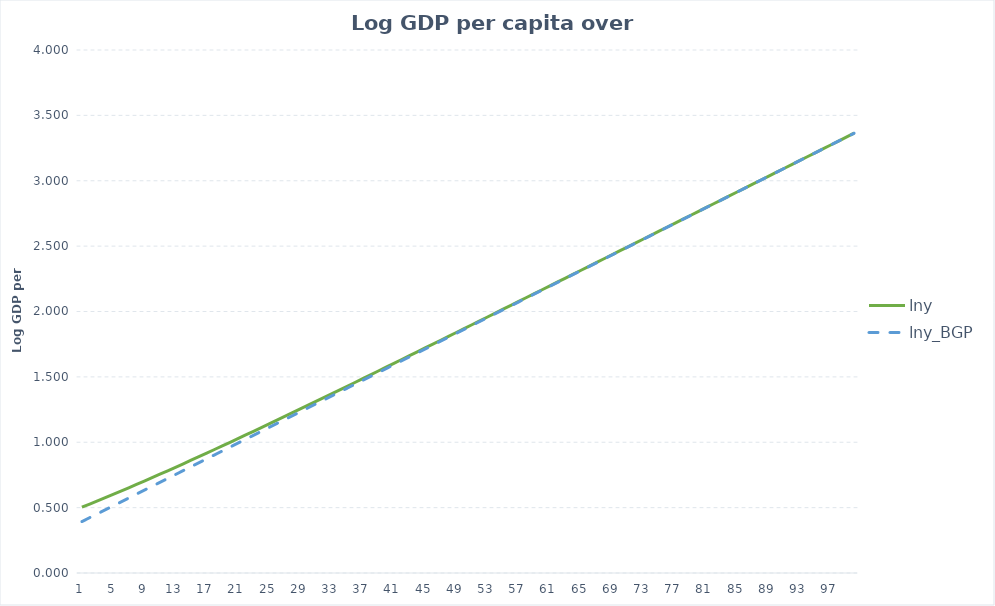
| Category | lny | lny_BGP |
|---|---|---|
| 0 | 0.503 | 0.393 |
| 1 | 0.527 | 0.423 |
| 2 | 0.552 | 0.453 |
| 3 | 0.576 | 0.483 |
| 4 | 0.601 | 0.513 |
| 5 | 0.626 | 0.543 |
| 6 | 0.652 | 0.573 |
| 7 | 0.677 | 0.603 |
| 8 | 0.703 | 0.633 |
| 9 | 0.729 | 0.663 |
| 10 | 0.755 | 0.693 |
| 11 | 0.782 | 0.723 |
| 12 | 0.809 | 0.753 |
| 13 | 0.835 | 0.783 |
| 14 | 0.862 | 0.813 |
| 15 | 0.89 | 0.843 |
| 16 | 0.917 | 0.873 |
| 17 | 0.944 | 0.903 |
| 18 | 0.972 | 0.933 |
| 19 | 1 | 0.963 |
| 20 | 1.028 | 0.993 |
| 21 | 1.056 | 1.023 |
| 22 | 1.084 | 1.053 |
| 23 | 1.112 | 1.083 |
| 24 | 1.14 | 1.113 |
| 25 | 1.169 | 1.143 |
| 26 | 1.197 | 1.173 |
| 27 | 1.226 | 1.203 |
| 28 | 1.255 | 1.233 |
| 29 | 1.283 | 1.263 |
| 30 | 1.312 | 1.293 |
| 31 | 1.341 | 1.323 |
| 32 | 1.37 | 1.353 |
| 33 | 1.399 | 1.383 |
| 34 | 1.428 | 1.413 |
| 35 | 1.457 | 1.443 |
| 36 | 1.486 | 1.473 |
| 37 | 1.516 | 1.503 |
| 38 | 1.545 | 1.533 |
| 39 | 1.574 | 1.563 |
| 40 | 1.603 | 1.593 |
| 41 | 1.633 | 1.623 |
| 42 | 1.662 | 1.653 |
| 43 | 1.692 | 1.683 |
| 44 | 1.721 | 1.713 |
| 45 | 1.751 | 1.743 |
| 46 | 1.78 | 1.773 |
| 47 | 1.81 | 1.803 |
| 48 | 1.84 | 1.833 |
| 49 | 1.869 | 1.863 |
| 50 | 1.899 | 1.893 |
| 51 | 1.928 | 1.923 |
| 52 | 1.958 | 1.953 |
| 53 | 1.988 | 1.983 |
| 54 | 2.018 | 2.013 |
| 55 | 2.047 | 2.043 |
| 56 | 2.077 | 2.073 |
| 57 | 2.107 | 2.103 |
| 58 | 2.137 | 2.133 |
| 59 | 2.166 | 2.163 |
| 60 | 2.196 | 2.193 |
| 61 | 2.226 | 2.223 |
| 62 | 2.256 | 2.253 |
| 63 | 2.286 | 2.283 |
| 64 | 2.316 | 2.313 |
| 65 | 2.345 | 2.343 |
| 66 | 2.375 | 2.373 |
| 67 | 2.405 | 2.403 |
| 68 | 2.435 | 2.433 |
| 69 | 2.465 | 2.463 |
| 70 | 2.495 | 2.493 |
| 71 | 2.525 | 2.523 |
| 72 | 2.555 | 2.553 |
| 73 | 2.585 | 2.583 |
| 74 | 2.615 | 2.613 |
| 75 | 2.644 | 2.643 |
| 76 | 2.674 | 2.673 |
| 77 | 2.704 | 2.703 |
| 78 | 2.734 | 2.733 |
| 79 | 2.764 | 2.763 |
| 80 | 2.794 | 2.793 |
| 81 | 2.824 | 2.823 |
| 82 | 2.854 | 2.853 |
| 83 | 2.884 | 2.883 |
| 84 | 2.914 | 2.913 |
| 85 | 2.944 | 2.943 |
| 86 | 2.974 | 2.973 |
| 87 | 3.004 | 3.003 |
| 88 | 3.034 | 3.033 |
| 89 | 3.064 | 3.063 |
| 90 | 3.094 | 3.093 |
| 91 | 3.124 | 3.123 |
| 92 | 3.154 | 3.153 |
| 93 | 3.184 | 3.183 |
| 94 | 3.214 | 3.213 |
| 95 | 3.244 | 3.243 |
| 96 | 3.274 | 3.273 |
| 97 | 3.304 | 3.303 |
| 98 | 3.334 | 3.333 |
| 99 | 3.364 | 3.363 |